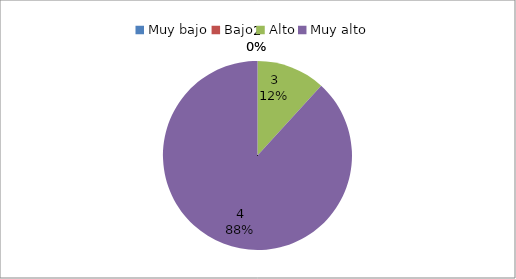
| Category | Series 0 |
|---|---|
| Muy bajo | 0 |
| Bajo | 0 |
| Alto | 2 |
| Muy alto | 15 |